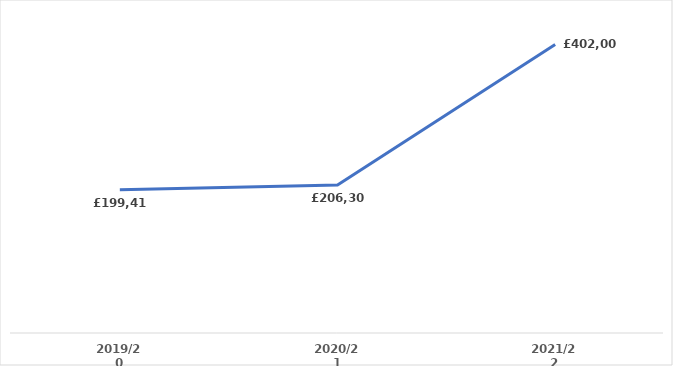
| Category | Series 0 |
|---|---|
| 2019/20 | 199409.57 |
| 2020/21 | 206309.27 |
| 2021/22 | 402006.16 |